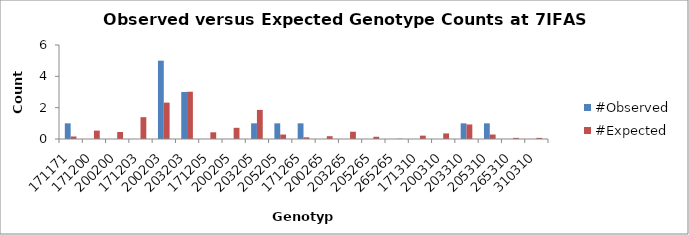
| Category | #Observed | #Expected |
|---|---|---|
| 171171.0 | 1 | 0.161 |
| 171200.0 | 0 | 0.536 |
| 200200.0 | 0 | 0.446 |
| 171203.0 | 0 | 1.393 |
| 200203.0 | 5 | 2.321 |
| 203203.0 | 3 | 3.018 |
| 171205.0 | 0 | 0.429 |
| 200205.0 | 0 | 0.714 |
| 203205.0 | 1 | 1.857 |
| 205205.0 | 1 | 0.286 |
| 171265.0 | 1 | 0.107 |
| 200265.0 | 0 | 0.179 |
| 203265.0 | 0 | 0.464 |
| 205265.0 | 0 | 0.143 |
| 265265.0 | 0 | 0.018 |
| 171310.0 | 0 | 0.214 |
| 200310.0 | 0 | 0.357 |
| 203310.0 | 1 | 0.929 |
| 205310.0 | 1 | 0.286 |
| 265310.0 | 0 | 0.071 |
| 310310.0 | 0 | 0.071 |